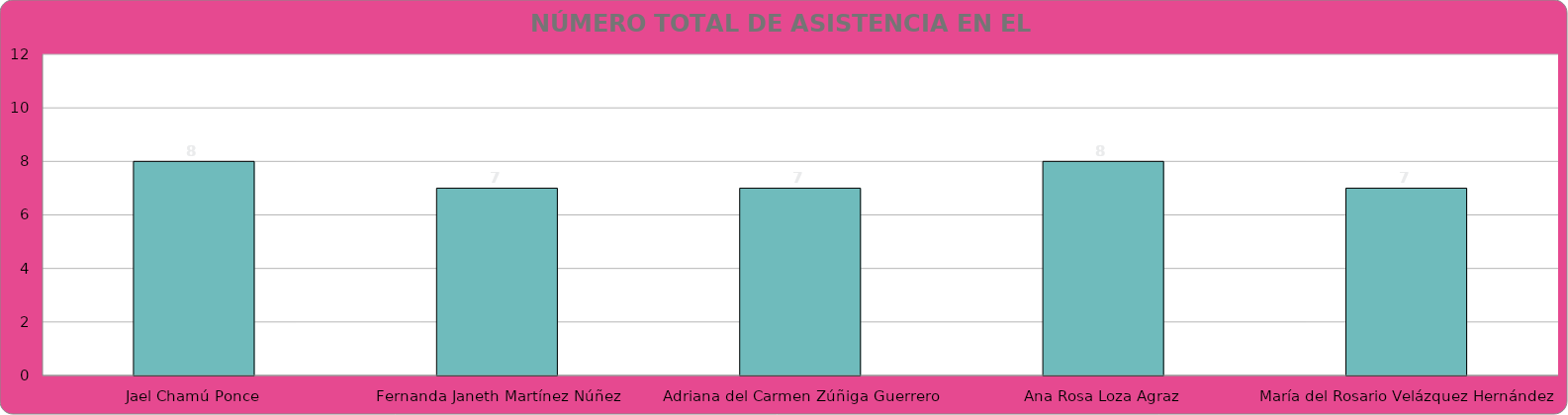
| Category | Jael Chamú Ponce Fernanda Janeth Martínez Núñez Adriana del Carmen Zúñiga Guerrero Ana Rosa Loza Agraz María del Rosario Velázquez Hernández Regidores Regidores Regidores Regidores |
|---|---|
| Jael Chamú Ponce | 8 |
| Fernanda Janeth Martínez Núñez | 7 |
| Adriana del Carmen Zúñiga Guerrero | 7 |
| Ana Rosa Loza Agraz | 8 |
| María del Rosario Velázquez Hernández | 7 |